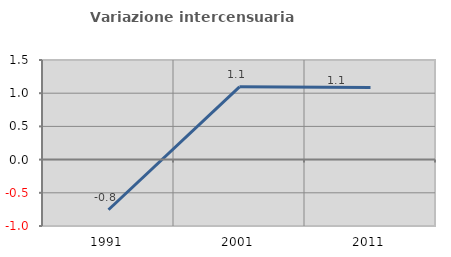
| Category | Variazione intercensuaria annua |
|---|---|
| 1991.0 | -0.756 |
| 2001.0 | 1.096 |
| 2011.0 | 1.087 |